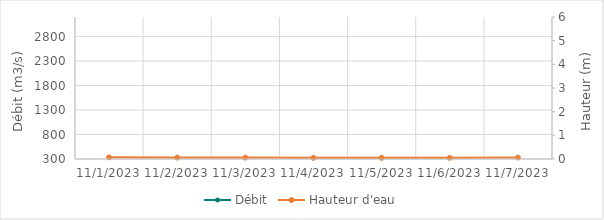
| Category | Débit |
|---|---|
| 5/11/23 | 1091.2 |
| 5/10/23 | 1086.3 |
| 5/9/23 | 1134 |
| 5/8/23 | 1045.72 |
| 5/7/23 | 928.48 |
| 5/6/23 | 812.3 |
| 5/5/23 | 772.59 |